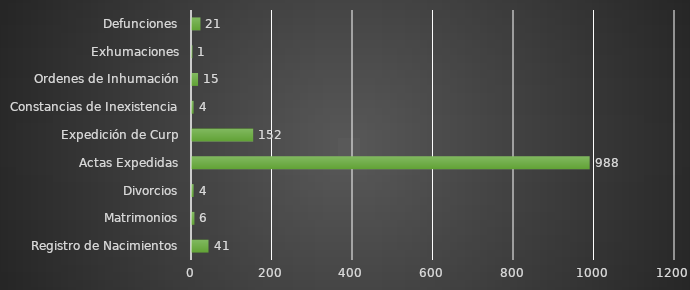
| Category | INDICADOR  |
|---|---|
| Registro de Nacimientos | 41 |
| Matrimonios | 6 |
| Divorcios | 4 |
| Actas Expedidas | 988 |
| Expedición de Curp | 152 |
| Constancias de Inexistencia | 4 |
| Ordenes de Inhumación | 15 |
| Exhumaciones | 1 |
| Defunciones | 21 |